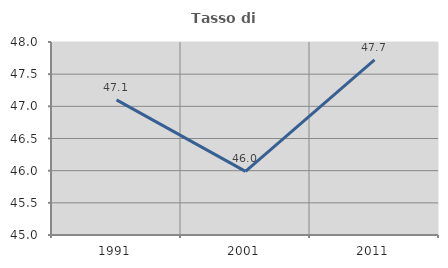
| Category | Tasso di occupazione   |
|---|---|
| 1991.0 | 47.1 |
| 2001.0 | 45.99 |
| 2011.0 | 47.721 |